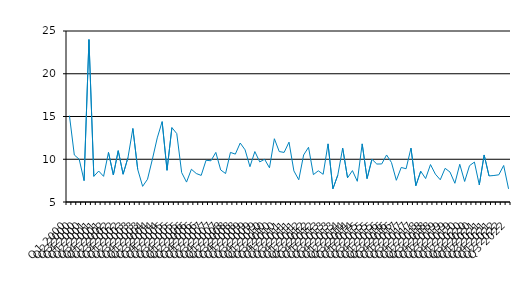
| Category | Series 0 |
|---|---|
| Q1 2000 | 15.1 |
| Q2 2000 | 10.5 |
| Q3 2000 | 10 |
| Q4 2000 | 7.5 |
| Q1 2001 | 24 |
| Q2 2001 | 8 |
| Q3 2001 | 8.62 |
| Q4 2001 | 8 |
| Q1 2002 | 10.8 |
| Q2 2002 | 8.16 |
| Q3 2002 | 11 |
| Q4 2002 | 8.25 |
| Q1 2003 | 10.2 |
| Q2 2003 | 13.6 |
| Q3 2003 | 8.8 |
| Q4 2003 | 6.83 |
| Q1 2004 | 7.66 |
| Q2 2004 | 10 |
| Q3 2004 | 12.5 |
| Q4 2004 | 14.4 |
| Q1 2005 | 8.71 |
| Q2 2005 | 13.7 |
| Q3 2005 | 13 |
| Q4 2005 | 8.44 |
| Q1 2006 | 7.33 |
| Q2 2006 | 8.83 |
| Q3 2006 | 8.33 |
| Q4 2006 | 8.11 |
| Q1 2007 | 9.88 |
| Q2 2007 | 9.82 |
| Q3 2007 | 10.8 |
| Q4 2007 | 8.75 |
| Q1 2008 | 8.33 |
| Q2 2008 | 10.8 |
| Q3 2008 | 10.6 |
| Q4 2008 | 11.9 |
| Q1 2009 | 11.1 |
| Q2 2009 | 9.13 |
| Q3 2009 | 10.9 |
| Q4 2009 | 9.69 |
| Q1 2010 | 10 |
| Q2 2010 | 9 |
| Q3 2010 | 12.4 |
| Q4 2010 | 10.9 |
| Q1 2011 | 10.8 |
| Q2 2011 | 12 |
| Q3 2011 | 8.64 |
| Q4 2011 | 7.6 |
| Q1 2012 | 10.5 |
| Q2 2012 | 11.4 |
| Q3 2012 | 8.2 |
| Q4 2012 | 8.65 |
| Q1 2013 | 8.24 |
| Q2 2013 | 11.8 |
| Q3 2013 | 6.55 |
| Q4 2013 | 8.14 |
| Q1 2014 | 11.3 |
| Q2 2014 | 7.83 |
| Q3 2014 | 8.67 |
| Q4 2014 | 7.42 |
| Q1 2015 | 11.8 |
| Q2 2015 | 7.74 |
| Q3 2015 | 10 |
| Q4 2015 | 9.44 |
| Q1 2016 | 9.45 |
| Q2 2016 | 10.5 |
| Q3 2016 | 9.62 |
| Q4 2016 | 7.54 |
| Q1 2017 | 9.04 |
| Q2 2017 | 8.89 |
| Q3 2017 | 11.3 |
| Q4 2017 | 6.91 |
| Q1 2018 | 8.6 |
| Q2 2018 | 7.74 |
| Q3 2018 | 9.38 |
| Q4 2018 | 8.26 |
| Q1 2019 | 7.6 |
| Q2 2019 | 8.941 |
| Q3 2019 | 8.5 |
| Q4 2019 | 7.19 |
| Q1 2020 | 9.41 |
| Q2 2020 | 7.4 |
| Q3 2020 | 9.25 |
| Q4 2020 | 9.67 |
| Q1 2021 | 7 |
| Q2 2021 | 10.5 |
| Q3 2021 | 8.05 |
| Q4 2021 | 8.1 |
| Q1 2022 | 8.18 |
| Q2 2022 | 9.27 |
| Q3 2022 | 6.54 |